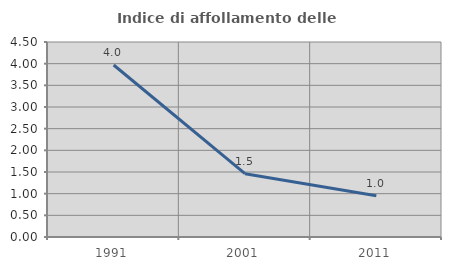
| Category | Indice di affollamento delle abitazioni  |
|---|---|
| 1991.0 | 3.969 |
| 2001.0 | 1.462 |
| 2011.0 | 0.954 |